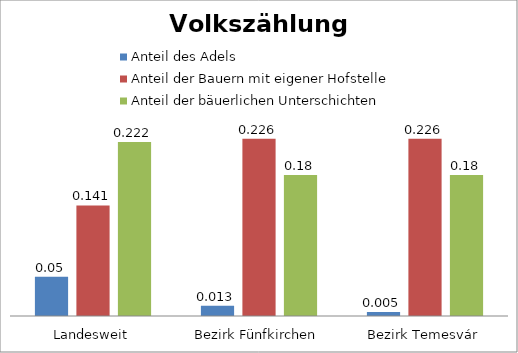
| Category | Anteil des Adels | Anteil der Bauern mit eigener Hofstelle | Anteil der bäuerlichen Unterschichten |
|---|---|---|---|
| Landesweit | 0.05 | 0.141 | 0.222 |
| Bezirk Fünfkirchen | 0.013 | 0.226 | 0.18 |
| Bezirk Temesvár | 0.005 | 0.226 | 0.18 |